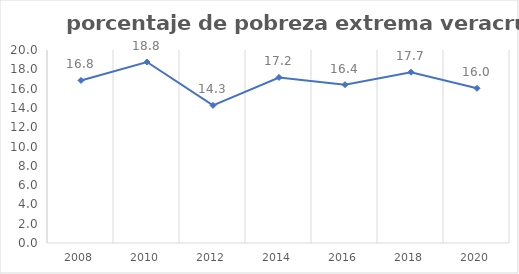
| Category | Series 0 |
|---|---|
| 2008.0 | 16.845 |
| 2010.0 | 18.757 |
| 2012.0 | 14.261 |
| 2014.0 | 17.154 |
| 2016.0 | 16.403 |
| 2018.0 | 17.699 |
| 2020.0 | 16.032 |